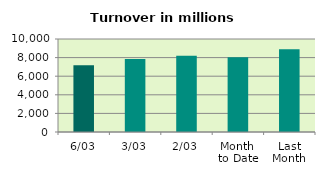
| Category | Series 0 |
|---|---|
| 6/03 | 7176.832 |
| 3/03 | 7842.905 |
| 2/03 | 8198.544 |
| Month 
to Date | 8037.217 |
| Last
Month | 8884.685 |